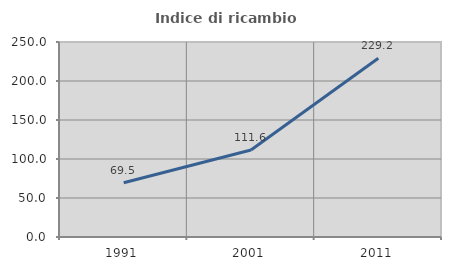
| Category | Indice di ricambio occupazionale  |
|---|---|
| 1991.0 | 69.474 |
| 2001.0 | 111.579 |
| 2011.0 | 229.231 |